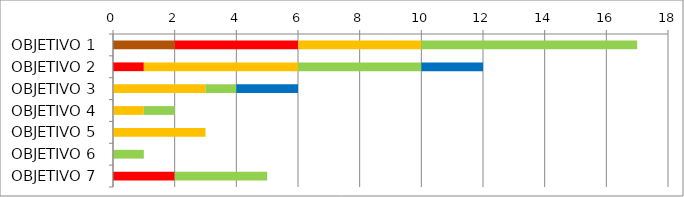
| Category | Series 0 | Series 1 | Series 2 | Series 3 | Series 4 | Series 5 |
|---|---|---|---|---|---|---|
| OBJETIVO 1 | 2 | 0 | 4 | 4 | 7 | 0 |
| OBJETIVO 2 | 0 | 0 | 1 | 5 | 4 | 2 |
| OBJETIVO 3 | 0 | 0 | 0 | 3 | 1 | 2 |
| OBJETIVO 4 | 0 | 0 | 0 | 1 | 1 | 0 |
| OBJETIVO 5 | 0 | 0 | 0 | 3 | 0 | 0 |
| OBJETIVO 6 | 0 | 0 | 0 | 0 | 1 | 0 |
| OBJETIVO 7 | 0 | 0 | 2 | 0 | 3 | 0 |